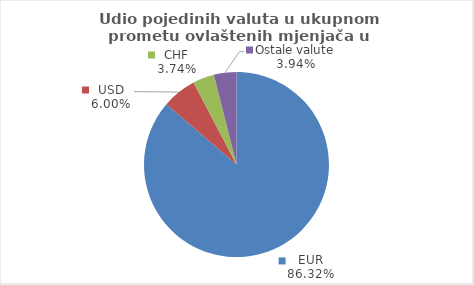
| Category | Series 0 |
|---|---|
| EUR | 86.316 |
| USD | 5.999 |
| CHF | 3.743 |
| Ostale valute | 3.942 |